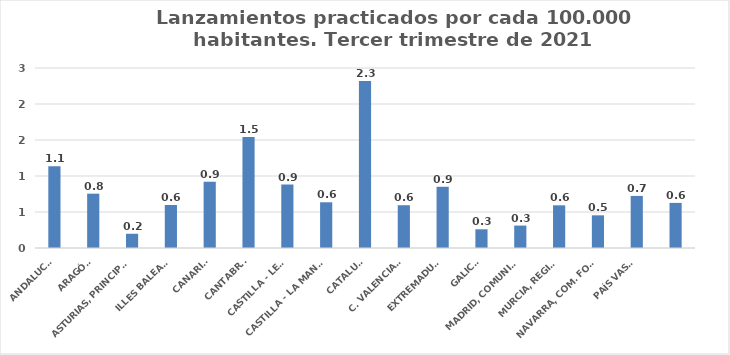
| Category | Series 0 |
|---|---|
| ANDALUCÍA | 1.135 |
| ARAGÓN | 0.755 |
| ASTURIAS, PRINCIPADO | 0.198 |
| ILLES BALEARS | 0.597 |
| CANARIAS | 0.921 |
| CANTABRIA | 1.54 |
| CASTILLA - LEÓN | 0.882 |
| CASTILLA - LA MANCHA | 0.635 |
| CATALUÑA | 2.321 |
| C. VALENCIANA | 0.594 |
| EXTREMADURA | 0.85 |
| GALICIA | 0.26 |
| MADRID, COMUNIDAD | 0.311 |
| MURCIA, REGIÓN | 0.593 |
| NAVARRA, COM. FORAL | 0.454 |
| PAÍS VASCO | 0.723 |